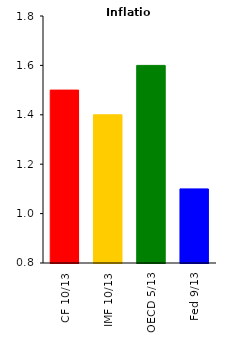
| Category | Inflation |
|---|---|
| CF 10/13 | 1.5 |
| IMF 10/13 | 1.4 |
| OECD 5/13 | 1.6 |
| Fed 9/13 | 1.1 |